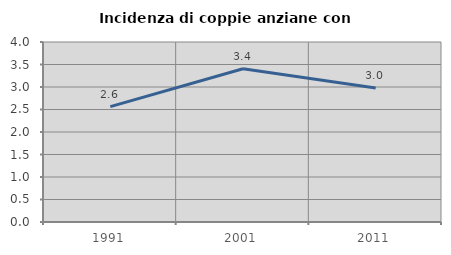
| Category | Incidenza di coppie anziane con figli |
|---|---|
| 1991.0 | 2.564 |
| 2001.0 | 3.405 |
| 2011.0 | 2.98 |